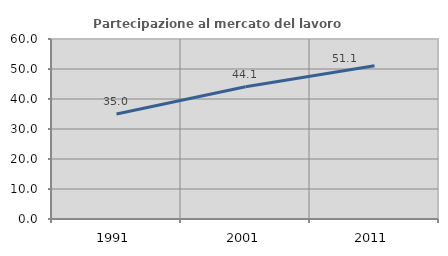
| Category | Partecipazione al mercato del lavoro  femminile |
|---|---|
| 1991.0 | 35.013 |
| 2001.0 | 44.056 |
| 2011.0 | 51.081 |